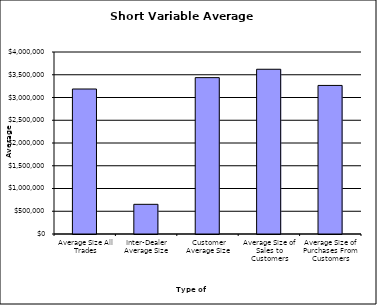
| Category | Security Type |
|---|---|
| Average Size All Trades | 3186526.603 |
| Inter-Dealer Average Size | 652210.505 |
| Customer Average Size | 3436783.563 |
| Average Size of Sales to Customers | 3620639.065 |
| Average Size of Purchases From Customers | 3265333.454 |